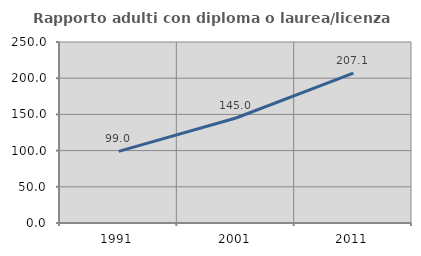
| Category | Rapporto adulti con diploma o laurea/licenza media  |
|---|---|
| 1991.0 | 99 |
| 2001.0 | 145 |
| 2011.0 | 207.092 |